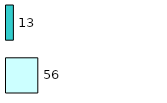
| Category | Series 0 | Series 1 |
|---|---|---|
| 0 | 56 | 13 |